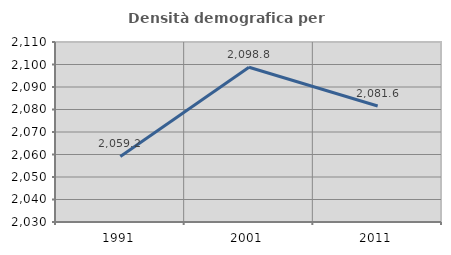
| Category | Densità demografica |
|---|---|
| 1991.0 | 2059.155 |
| 2001.0 | 2098.782 |
| 2011.0 | 2081.553 |